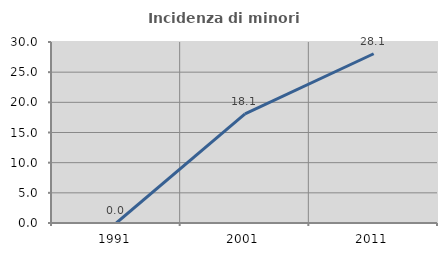
| Category | Incidenza di minori stranieri |
|---|---|
| 1991.0 | 0 |
| 2001.0 | 18.072 |
| 2011.0 | 28.054 |